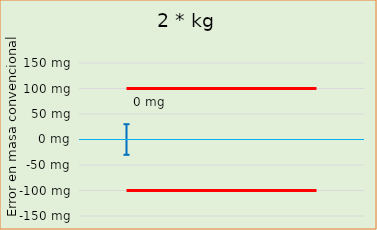
| Category | #N/D |  ± EMP |
|---|---|---|
| 0 |  | -100 |
| 1 |  | -100 |
| 2 |  | -100 |